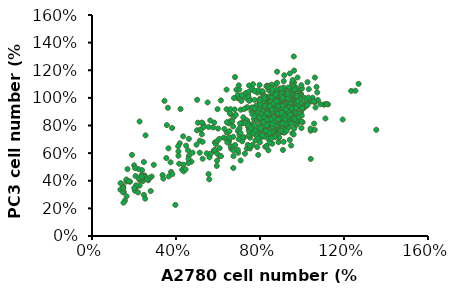
| Category | PC3 |
|---|---|
| 0.9260116677470136 | 0.946 |
| 0.6408000740809334 | 0.918 |
| 0.8423002129826835 | 0.901 |
| 0.8823039170293546 | 0.904 |
| 0.4341142698398 | 0.722 |
| 0.8156310769515696 | 0.885 |
| 0.8897120103713306 | 0.888 |
| 0.9097138623946661 | 0.912 |
| 0.3452171497360867 | 0.978 |
| 0.9200851930734327 | 0.929 |
| 0.9023057690526901 | 0.923 |
| 0.9097138623946661 | 0.904 |
| 0.8778590610241689 | 0.909 |
| 0.8378553569774979 | 0.913 |
| 0.9037873877210852 | 0.896 |
| 0.9630521344568942 | 0.925 |
| 0.7830354662468747 | 0.94 |
| 0.8326696916381147 | 0.975 |
| 0.8904528197055283 | 0.93 |
| 0.9141587183998519 | 0.901 |
| 0.858598018335031 | 0.901 |
| 0.9334197610889897 | 0.891 |
| 0.9111954810630614 | 0.905 |
| 1.1045467172886378 | 0.951 |
| 0.7645152328919345 | 1.059 |
| 0.8911936290397259 | 1.015 |
| 0.8904528197055283 | 0.996 |
| 0.9763867024724512 | 0.992 |
| 0.8534123529956478 | 0.908 |
| 0.8897120103713306 | 0.961 |
| 0.9356421890915826 | 0.933 |
| 1.075655153254931 | 0.985 |
| 0.694879155477359 | 0.997 |
| 0.8230391702935457 | 0.98 |
| 0.8734142050189833 | 0.955 |
| 0.8060005556070007 | 0.964 |
| 0.7363644781924252 | 0.93 |
| 0.9682377997962774 | 0.908 |
| 0.8608204463376239 | 0.904 |
| 1.113436429299009 | 0.956 |
| 0.6874710621353829 | 1.059 |
| 0.7341420501898324 | 1 |
| 0.8111862209463839 | 1.031 |
| 0.3970738031299194 | 0.225 |
| 0.8430410223168812 | 0.974 |
| 0.9734234651356607 | 0.973 |
| 0.862302065006019 | 0.964 |
| 0.9430502824335587 | 0.991 |
| 0.7978516529308269 | 1.094 |
| 0.6763589221224188 | 0.999 |
| 0.7534030928789702 | 0.985 |
| 0.8274840262987314 | 0.94 |
| 0.8208167422909529 | 0.964 |
| 0.7971108435966293 | 0.939 |
| 0.8637836836744143 | 0.956 |
| 1.0504676358922123 | 1.001 |
| 0.6408000740809334 | 1.06 |
| 0.597833132697472 | 0.918 |
| 0.7400685248634132 | 0.932 |
| 0.7430317622002037 | 1.027 |
| 0.8252615982961385 | 0.927 |
| 0.7741457542365033 | 0.986 |
| 0.8363737383091027 | 1.005 |
| 0.925270858412816 | 1.038 |
| 1.0726919159181405 | 1.039 |
| 0.7897027502546532 | 0.929 |
| 0.7593295675525512 | 0.903 |
| 0.8630428743402166 | 0.85 |
| 0.8482266876562645 | 0.888 |
| 0.8882303917029355 | 0.942 |
| 0.9297157144180017 | 0.896 |
| 1.045281970552829 | 0.974 |
| 0.8534123529956478 | 0.996 |
| 0.8022965089360126 | 0.938 |
| 0.5504213353088249 | 0.967 |
| 0.22668765626446893 | 0.829 |
| 0.771182516899713 | 0.846 |
| 0.831928882303917 | 0.877 |
| 0.8022965089360126 | 0.965 |
| 0.965274562459487 | 1.001 |
| 0.8210005706676812 | 0.978 |
| 0.8735019973368842 | 0.944 |
| 0.8818717899942933 | 0.873 |
| 0.9214380825565912 | 0.813 |
| 0.9267643142476698 | 0.804 |
| 1.0112231310633442 | 0.954 |
| 0.9602434848773065 | 0.827 |
| 0.7601293513410691 | 0.929 |
| 0.9686132775347156 | 0.908 |
| 0.7920867414875404 | 0.936 |
| 0.6574091687274111 | 0.831 |
| 0.9298078752140004 | 0.859 |
| 0.9762221799505422 | 0.811 |
| 0.9678523872931329 | 0.859 |
| 0.948069241011984 | 0.898 |
| 0.9396994483545749 | 0.982 |
| 0.9085029484496862 | 0.925 |
| 0.8400228267072475 | 0.904 |
| 0.8156743389766026 | 0.846 |
| 0.7631729123073997 | 0.748 |
| 0.8210005706676812 | 0.776 |
| 0.5820810348107286 | 0.821 |
| 0.8438272779151608 | 0.927 |
| 0.9085029484496862 | 0.982 |
| 0.9336123264219136 | 1.001 |
| 0.8780673387863801 | 0.915 |
| 0.8674148754042229 | 0.892 |
| 0.9054593874833555 | 0.802 |
| 0.983070192124786 | 0.837 |
| 1.0074186798554308 | 0.925 |
| 0.9442647898040708 | 0.93 |
| 1.2341639718470612 | 1.05 |
| 0.8308921438082557 | 1.002 |
| 0.8620886437131444 | 0.932 |
| 0.9686132775347156 | 0.857 |
| 0.8194787901845159 | 0.857 |
| 0.8118698877686894 | 0.946 |
| 0.8286094730835077 | 0.818 |
| 0.8293703633250904 | 0.89 |
| 0.8293703633250904 | 0.86 |
| 0.9107856191744341 | 0.846 |
| 0.9678523872931329 | 0.895 |
| 0.932851436180331 | 0.854 |
| 0.8696975461289709 | 0.769 |
| 0.9267643142476698 | 0.773 |
| 0.8894806924101198 | 0.754 |
| 0.8575233022636485 | 0.813 |
| 0.8818717899942933 | 0.838 |
| 1.0272018261365798 | 0.963 |
| 0.9244816435229218 | 0.867 |
| 0.8483926193646566 | 0.818 |
| 0.2548982309301883 | 0.729 |
| 0.8833935704774586 | 0.877 |
| 0.948069241011984 | 0.873 |
| 0.8856762412022066 | 0.83 |
| 0.9396994483545749 | 0.816 |
| 0.8704584363705535 | 0.937 |
| 0.8103481072855241 | 0.839 |
| 0.9130682898991821 | 0.749 |
| 0.9130682898991821 | 0.796 |
| 0.8628495339547271 | 0.854 |
| 0.9343732166634963 | 0.863 |
| 0.9229598630397565 | 0.842 |
| 0.42153319383678906 | 0.919 |
| 0.5006657789613849 | 0.986 |
| 0.8346965950161689 | 0.836 |
| 0.7951303024538711 | 0.716 |
| 0.8963287045843638 | 0.751 |
| 0.49990488871980215 | 0.765 |
| 0.8696975461289709 | 0.882 |
| 0.9686132775347156 | 0.949 |
| 1.0188320334791707 | 0.94 |
| 0.9107856191744341 | 0.853 |
| 0.9404603385961575 | 0.867 |
| 0.9024158265170249 | 0.784 |
| 0.8902415826517025 | 0.961 |
| 0.9275252044892525 | 1.051 |
| 0.9435038995624881 | 1.064 |
| 0.9602434848773065 | 0.966 |
| 0.8955678143427811 | 1.02 |
| 0.6607535194076003 | 0.822 |
| 0.7994141101798357 | 0.967 |
| 0.8280576124989828 | 0.833 |
| 0.7922532346000488 | 0.855 |
| 0.8632110017088453 | 0.833 |
| 0.8749287981121328 | 0.954 |
| 0.8807876963137765 | 0.978 |
| 0.6939539425502482 | 1.02 |
| 0.8104809178940516 | 0.95 |
| 0.9322158027504273 | 0.942 |
| 0.9315648140613557 | 0.884 |
| 0.9048742778094231 | 0.89 |
| 0.9680201806493612 | 0.964 |
| 0.8156888274066239 | 0.863 |
| 0.8697208885995605 | 0.906 |
| 0.8521441939946294 | 0.922 |
| 0.8254536577426967 | 0.985 |
| 0.38147937179591507 | 0.782 |
| 0.9478395312881439 | 0.95 |
| 0.9165920742127106 | 0.865 |
| 0.8768817641793474 | 0.881 |
| 0.9374237122629995 | 0.978 |
| 0.891203515338921 | 1.002 |
| 0.8892505492717064 | 0.967 |
| 0.8658149564651314 | 1.026 |
| 0.8189437708519814 | 0.972 |
| 0.8664659451542029 | 0.996 |
| 0.8859956058263487 | 0.998 |
| 0.9231019611034258 | 1.023 |
| 0.8977134022296362 | 0.961 |
| 0.8410773862804134 | 1.055 |
| 0.8339165107006266 | 1.089 |
| 0.9439335991537147 | 0.863 |
| 0.7824884042639759 | 0.945 |
| 0.925705915859712 | 0.945 |
| 0.9231019611034258 | 0.948 |
| 0.7069737163316787 | 0.996 |
| 0.9458865652209293 | 0.918 |
| 0.8449833184148425 | 1.01 |
| 0.9120351533892098 | 1.028 |
| 0.8293595898771259 | 0.938 |
| 0.9602083163805029 | 0.999 |
| 0.8202457482301245 | 0.983 |
| 0.9374237122629995 | 0.959 |
| 0.9374237122629995 | 0.932 |
| 0.9615102937586459 | 1.086 |
| 0.9185450402799251 | 0.98 |
| 0.8684189112214176 | 1.038 |
| 0.7831393929530475 | 0.911 |
| 0.9465375539100008 | 0.913 |
| 0.9465375539100008 | 0.94 |
| 0.9204980063471397 | 0.905 |
| 0.9074782325657091 | 0.926 |
| 0.9400276670192855 | 0.908 |
| 0.998616649035723 | 0.951 |
| 0.95044348604443 | 0.871 |
| 0.8007160875579786 | 0.994 |
| 0.8606070469525592 | 1.05 |
| 0.8664659451542029 | 1.044 |
| 0.9491415086662869 | 0.972 |
| 0.9003173569859224 | 1.02 |
| 0.9530474408007161 | 1.086 |
| 0.8957604361624216 | 1.03 |
| 0.9608593050695744 | 1.3 |
| 0.8462852957929856 | 1.087 |
| 0.8514932053055578 | 0.998 |
| 1.0643665066319472 | 0.93 |
| 0.9953617055903654 | 0.898 |
| 0.9940597282122223 | 1.023 |
| 0.9660672145821466 | 1.006 |
| 0.9328667914394987 | 0.983 |
| 0.9328667914394987 | 1.054 |
| 0.9348197575067133 | 1.018 |
| 0.8905525266498494 | 0.975 |
| 0.9725771014728619 | 0.924 |
| 0.9029213117422085 | 0.986 |
| 0.5045162340304338 | 0.82 |
| 0.9296118479941411 | 1.015 |
| 0.9953617055903654 | 1.03 |
| 1.0324680608674424 | 1.063 |
| 0.9274790330537741 | 1.028 |
| 0.9248478868607137 | 0.906 |
| 0.9248478868607137 | 0.943 |
| 0.8097352409143233 | 0.818 |
| 0.8643315244203256 | 0.861 |
| 0.9583950008222332 | 1.014 |
| 0.9248478868607137 | 1.021 |
| 0.9222167406676534 | 0.951 |
| 0.874198322644302 | 1.097 |
| 0.7136984048676205 | 1.019 |
| 0.8663048840651209 | 0.875 |
| 0.8919585594474593 | 0.867 |
| 0.9031409307679658 | 0.935 |
| 0.9537904949843776 | 1.108 |
| 0.9629995066600888 | 1.11 |
| 0.9544482815326426 | 1.11 |
| 0.8123663871073836 | 1.043 |
| 0.7452721591843446 | 1.01 |
| 0.8307844104588061 | 1.084 |
| 0.8695938168064463 | 0.98 |
| 0.9314257523433646 | 0.968 |
| 0.8584114454859398 | 0.977 |
| 0.8649893109685907 | 0.964 |
| 0.8557802992928795 | 1.096 |
| 0.8788028284821575 | 1.018 |
| 0.8663048840651209 | 0.951 |
| 0.9419503371156059 | 1.177 |
| 0.8334155566518665 | 0.929 |
| 0.9524749218878474 | 0.975 |
| 0.8853806939648085 | 1.025 |
| 0.9123499424436771 | 1.075 |
| 0.89722085183358 | 0.926 |
| 0.9044565038644959 | 1.049 |
| 0.9090610097023516 | 1.023 |
| 0.9360302581812202 | 1.076 |
| 0.8018418023351422 | 0.971 |
| 0.8886696267061338 | 1.048 |
| 0.7814504193389246 | 0.915 |
| 0.9189278079263279 | 0.989 |
| 0.9044565038644959 | 0.924 |
| 0.672915638875185 | 0.492 |
| 0.9406347640190759 | 0.93 |
| 0.9156388751850024 | 1.164 |
| 0.732774214767308 | 1.035 |
| 0.8584114454859398 | 0.986 |
| 0.7873704982733103 | 1.038 |
| 0.8814339746752179 | 1.189 |
| 0.9695773721427396 | 0.966 |
| 0.7643479690840322 | 0.929 |
| 0.8965630652853149 | 0.963 |
| 0.9130077289919422 | 1.121 |
| 0.9209011675711232 | 1.023 |
| 0.89722085183358 | 0.944 |
| 0.9814175300115112 | 1.051 |
| 0.9998355533629337 | 1.068 |
| 0.9728663048840651 | 0.959 |
| 0.9097187962506167 | 0.776 |
| 0.8248643315244203 | 0.955 |
| 0.9320835388916296 | 0.993 |
| 0.9182700213780628 | 0.75 |
| 0.7492188784739352 | 0.79 |
| 0.9551060680809077 | 0.986 |
| 0.9820753165597763 | 1.028 |
| 0.6597599079098833 | 0.884 |
| 0.9333991119881598 | 0.934 |
| 0.9399769774708108 | 0.939 |
| 0.9399769774708108 | 1.012 |
| 0.8834073343200132 | 0.936 |
| 0.747903305377405 | 1.09 |
| 0.8807761881269528 | 1.039 |
| 0.9557638546291728 | 1.129 |
| 0.9623417201118237 | 1.197 |
| 0.919585594474593 | 0.835 |
| 0.8952474921887847 | 1.067 |
| 0.9110343693471469 | 0.981 |
| 0.9445814833086663 | 1.003 |
| 0.9248478868607137 | 0.985 |
| 0.9603683604670284 | 1.083 |
| 0.9478704160499918 | 1.008 |
| 0.9893109685906923 | 1.021 |
| 0.954176388240784 | 0.876 |
| 0.9459636024265049 | 0.93 |
| 0.9795613625758283 | 0.945 |
| 0.7600559962669156 | 0.745 |
| 0.7637890807279515 | 0.808 |
| 1.026598226784881 | 0.97 |
| 0.9041530564629024 | 0.939 |
| 0.842183854409706 | 0.867 |
| 0.8511432571161922 | 0.939 |
| 0.8563695753616426 | 1.002 |
| 1.0415305646290247 | 0.762 |
| 1.1117125524965001 | 0.851 |
| 0.8720485300979934 | 0.866 |
| 0.854129724685021 | 0.935 |
| 0.1351376574895007 | 0.336 |
| 0.8832477834811012 | 1.017 |
| 0.9489500699953336 | 0.98 |
| 0.9108726084927672 | 0.964 |
| 0.9250583294447037 | 0.96 |
| 0.8795146990200653 | 0.91 |
| 0.8937004199720019 | 0.917 |
| 0.6592627158189454 | 0.918 |
| 0.8981801213252449 | 0.986 |
| 0.8989267382174522 | 0.995 |
| 1.0691553896406907 | 1.08 |
| 0.19038730751283248 | 0.587 |
| 0.9317778814745684 | 0.967 |
| 0.8929538030797947 | 0.92 |
| 0.9332711152589828 | 1.027 |
| 0.9601493233784414 | 1.04 |
| 0.8623425104993 | 0.891 |
| 0.9168455436304246 | 0.941 |
| 0.7010732617825478 | 1.06 |
| 0.9078861409239384 | 0.928 |
| 0.9571628558096127 | 1.023 |
| 0.8974335044330378 | 0.818 |
| 0.9243117125524964 | 0.853 |
| 0.9116192253849743 | 0.933 |
| 0.9489500699953336 | 0.885 |
| 0.9153523098460102 | 0.899 |
| 0.6809146056929538 | 1.151 |
| 0.8391973868408773 | 1.078 |
| 0.8787680821278582 | 0.901 |
| 0.8160522631824545 | 0.87 |
| 0.9720951936537564 | 1.072 |
| 0.9377508166122258 | 0.788 |
| 0.36136257582827813 | 0.928 |
| 0.9810545963602426 | 0.98 |
| 0.8586094260382641 | 1.06 |
| 0.9041530564629024 | 1.032 |
| 0.9930004666355576 | 0.937 |
| 0.8563695753616426 | 0.815 |
| 1.1236584227718152 | 0.953 |
| 0.9892673821745217 | 0.885 |
| 0.926551563229118 | 0.762 |
| 0.9594027064862343 | 0.823 |
| 0.6988334111059262 | 1.091 |
| 0.745870275314979 | 1.044 |
| 0.7622958469435371 | 1.067 |
| 0.6137190853943071 | 0.982 |
| 0.7988800746616892 | 0.915 |
| 0.8496500233317779 | 0.908 |
| 0.9989734017732151 | 0.873 |
| 0.8130657956136258 | 0.908 |
| 0.8108259449370042 | 1.049 |
| 0.8571161922538497 | 1.039 |
| 0.8772748483434438 | 1.057 |
| 0.8698086794213719 | 0.979 |
| 0.9362575828278115 | 0.963 |
| 0.9982267848810079 | 0.936 |
| 1.0601959869342044 | 0.968 |
| 0.7667755482967802 | 1.099 |
| 0.8406906206252917 | 0.898 |
| 0.8511432571161922 | 0.972 |
| 0.7921605226318246 | 1.056 |
| 0.822025198320112 | 0.943 |
| 0.8526364909006067 | 1.072 |
| 0.9706019598693421 | 1.013 |
| 1.0878208119458703 | 0.954 |
| 0.9788147456836211 | 1.148 |
| 0.3765527950310559 | 0.464 |
| 0.20419254658385094 | 0.328 |
| 0.18090062111801242 | 0.393 |
| 0.8400621118012422 | 0.621 |
| 0.7368012422360248 | 0.632 |
| 0.8586956521739131 | 0.668 |
| 0.7523291925465838 | 0.633 |
| 0.9790372670807453 | 1.007 |
| 0.35403726708074534 | 0.564 |
| 0.2422360248447205 | 0.397 |
| 0.43478260869565216 | 0.516 |
| 0.6071428571428571 | 0.579 |
| 0.8881987577639752 | 0.68 |
| 0.8936335403726708 | 0.757 |
| 0.9914596273291926 | 0.831 |
| 0.7756211180124224 | 0.749 |
| 0.20729813664596272 | 0.434 |
| 0.3641304347826087 | 0.635 |
| 0.6964285714285714 | 0.758 |
| 0.7523291925465838 | 0.712 |
| 0.7888198757763976 | 0.74 |
| 0.781832298136646 | 0.728 |
| 0.7468944099378882 | 0.772 |
| 0.7476708074534162 | 0.73 |
| 0.8222049689440993 | 1.015 |
| 0.7282608695652174 | 0.596 |
| 0.47360248447204967 | 0.538 |
| 0.2267080745341615 | 0.365 |
| 0.6964285714285714 | 0.603 |
| 0.5846273291925466 | 0.677 |
| 0.20729813664596272 | 0.349 |
| 0.6420807453416149 | 0.749 |
| 0.7243788819875776 | 0.714 |
| 0.9736024844720497 | 0.806 |
| 0.2841614906832298 | 0.43 |
| 0.8346273291925466 | 0.727 |
| 0.42934782608695654 | 0.479 |
| 0.84472049689441 | 0.713 |
| 0.5768633540372671 | 0.786 |
| 0.45729813664596275 | 0.621 |
| 0.2942546583850932 | 0.515 |
| 0.7919254658385093 | 0.772 |
| 0.8043478260869565 | 0.931 |
| 0.5551242236024845 | 0.448 |
| 0.922360248447205 | 0.802 |
| 0.7927018633540373 | 0.919 |
| 0.8020186335403726 | 0.768 |
| 0.9456521739130435 | 0.892 |
| 0.562888198757764 | 0.836 |
| 0.8517080745341615 | 0.717 |
| 0.6956521739130435 | 0.764 |
| 0.2468944099378882 | 0.536 |
| 0.53027950310559 | 0.807 |
| 0.7360248447204969 | 0.836 |
| 0.7274844720496895 | 0.836 |
| 0.8711180124223602 | 0.848 |
| 0.8812111801242236 | 1.109 |
| 0.8874223602484472 | 0.848 |
| 0.7600931677018633 | 0.757 |
| 0.8889751552795031 | 0.712 |
| 0.23680124223602483 | 0.443 |
| 0.25077639751552794 | 0.438 |
| 0.23835403726708074 | 0.477 |
| 0.7958074534161491 | 0.798 |
| 0.9425465838509317 | 1.016 |
| 0.8781055900621118 | 0.827 |
| 1.0015527950310559 | 0.924 |
| 0.9021739130434783 | 0.79 |
| 0.7857142857142857 | 0.838 |
| 0.4611801242236025 | 0.579 |
| 0.7383540372670807 | 0.836 |
| 1.0566770186335404 | 0.974 |
| 0.22127329192546583 | 0.484 |
| 0.44798136645962733 | 0.654 |
| 0.702639751552795 | 0.78 |
| 0.7204968944099379 | 0.859 |
| 0.6793478260869565 | 0.916 |
| 0.6545031055900621 | 0.758 |
| 0.717391304347826 | 0.824 |
| 0.9953416149068323 | 0.964 |
| 0.7124448367166814 | 0.696 |
| 0.8444836716681376 | 0.798 |
| 0.8889673433362754 | 0.739 |
| 0.20970873786407768 | 0.367 |
| 1.002647837599294 | 0.823 |
| 0.8691968225948808 | 0.772 |
| 0.8218887908208297 | 0.806 |
| 1.0259488084730803 | 0.947 |
| 0.7915269196822595 | 0.587 |
| 0.43636363636363634 | 0.468 |
| 0.8614298323036187 | 0.846 |
| 1.0407766990291263 | 0.778 |
| 0.7781112091791703 | 0.691 |
| 0.8910856134157105 | 0.714 |
| 0.37422771403353927 | 0.534 |
| 1.0005295675198589 | 0.926 |
| 0.8190644307149162 | 0.72 |
| 0.5959399823477494 | 0.598 |
| 0.8903795233892321 | 0.88 |
| 0.8903795233892321 | 0.767 |
| 0.5825242718446602 | 0.62 |
| 0.2796116504854369 | 0.325 |
| 0.9807590467784643 | 0.942 |
| 1.1170344218887909 | 0.955 |
| 0.7025595763459841 | 0.734 |
| 0.8854368932038835 | 0.822 |
| 0.8522506619593998 | 0.91 |
| 0.7985878199470432 | 0.703 |
| 0.953927625772286 | 0.743 |
| 0.9659311562224183 | 0.819 |
| 0.8776699029126214 | 0.952 |
| 0.35657546337157986 | 0.803 |
| 0.7555163283318623 | 0.767 |
| 0.8473080317740512 | 0.858 |
| 0.9433362753751103 | 0.855 |
| 0.8289496910856134 | 0.768 |
| 0.9977052074139453 | 0.83 |
| 0.9299205648720212 | 0.823 |
| 0.9221535745807591 | 0.911 |
| 0.9285083848190644 | 1.037 |
| 0.7180935569285084 | 0.815 |
| 0.8042365401588703 | 0.886 |
| 0.7865842894969108 | 0.866 |
| 0.8529567519858782 | 0.752 |
| 0.9355692850838482 | 0.94 |
| 0.9920564872021183 | 0.991 |
| 1.0132391879964695 | 0.999 |
| 0.9659311562224183 | 1.062 |
| 0.5902912621359223 | 0.666 |
| 0.2266548984995587 | 0.411 |
| 0.8473080317740512 | 0.93 |
| 0.25136804942630186 | 0.428 |
| 0.7449249779346867 | 0.816 |
| 1.0217122683142101 | 0.987 |
| 0.9786407766990292 | 1.033 |
| 1.26954986760812 | 1.102 |
| 0.860017652250662 | 0.75 |
| 0.6524271844660194 | 0.684 |
| 0.7442188879082083 | 0.79 |
| 0.5959399823477494 | 0.687 |
| 0.9094439541041482 | 0.623 |
| 0.6058252427184466 | 0.703 |
| 0.8875551632833186 | 0.92 |
| 1.0612533097969992 | 1.147 |
| 0.7300970873786408 | 0.818 |
| 0.5133274492497794 | 0.69 |
| 0.2266548984995587 | 0.406 |
| 0.9045013239187997 | 0.906 |
| 0.336098852603707 | 0.442 |
| 0.23654015887025595 | 0.412 |
| 0.41800529567519856 | 0.671 |
| 0.8812003530450132 | 1.031 |
| 0.7639894086496029 | 0.882 |
| 0.942630185348632 | 0.843 |
| 0.8007060900264784 | 0.944 |
| 0.893909973521624 | 0.768 |
| 0.8621359223300971 | 0.836 |
| 0.8409532215357458 | 0.807 |
| 0.7894086496028243 | 0.856 |
| 0.7738746690203001 | 1.05 |
| 0.6080741742321808 | 0.636 |
| 0.9627197218466294 | 0.777 |
| 0.7417423218079969 | 0.659 |
| 0.79119180992853 | 0.707 |
| 0.6629322001158973 | 0.632 |
| 0.7865559204172301 | 0.644 |
| 0.873092524628163 | 0.81 |
| 0.8978172686884296 | 0.835 |
| 0.559397334363531 | 0.569 |
| 0.22406799304616573 | 0.418 |
| 0.7077457987251304 | 0.547 |
| 0.9604017770909793 | 0.735 |
| 0.16457407765114931 | 0.287 |
| 0.21943210353486575 | 0.316 |
| 0.238748309831949 | 0.422 |
| 0.2742901294185822 | 0.42 |
| 0.41182151825381497 | 0.612 |
| 0.6722039791384972 | 0.794 |
| 0.7154722812439637 | 0.685 |
| 0.8128259609812633 | 0.735 |
| 0.9124975854742129 | 0.682 |
| 1.041529843538729 | 0.558 |
| 0.26810894340351554 | 0.404 |
| 1.193741549159745 | 0.843 |
| 0.16380142939926598 | 0.395 |
| 0.8251883330113966 | 0.646 |
| 0.24724744060266562 | 0.298 |
| 0.5269461077844312 | 0.559 |
| 0.8738651728800464 | 0.725 |
| 0.15684759513231603 | 0.256 |
| 0.6737492756422638 | 0.578 |
| 1.0608460498358123 | 0.769 |
| 0.6946107784431138 | 0.623 |
| 0.8043268302105466 | 0.765 |
| 0.6606142553602472 | 0.649 |
| 0.8298242225226965 | 0.65 |
| 0.14989376086536604 | 0.241 |
| 0.6273903805292641 | 0.712 |
| 0.7641491211126135 | 0.659 |
| 1.3536797372995943 | 0.769 |
| 0.5153563840061812 | 0.77 |
| 0.5462623140815144 | 0.599 |
| 0.6142553602472475 | 0.578 |
| 0.14834846436159937 | 0.361 |
| 0.3654626231408151 | 0.432 |
| 0.6397527525593973 | 0.703 |
| 0.8390960015452965 | 0.839 |
| 0.8414139463009465 | 0.734 |
| 0.20088854548966584 | 0.512 |
| 0.2534286266177323 | 0.271 |
| 0.5941665056982809 | 0.507 |
| 0.7525593973343635 | 0.653 |
| 0.8390960015452965 | 0.705 |
| 0.8460498358122465 | 0.677 |
| 0.948039405060846 | 0.655 |
| 0.8035541819586633 | 0.849 |
| 0.4102762217500483 | 0.65 |
| 0.8313695190264632 | 0.65 |
| 0.9418582190457794 | 0.696 |
| 0.5957118022020476 | 0.544 |
| 1.057755456828279 | 0.814 |
| 0.971218852617346 | 0.836 |
| 0.9488120533127293 | 0.814 |
| 0.6304809735367973 | 0.776 |
| 0.7873285686691134 | 0.889 |
| 0.8197797952482132 | 0.72 |
| 0.718562874251497 | 0.715 |
| 0.8700019316206297 | 0.715 |
| 0.5130384392505312 | 0.603 |
| 0.5655785203785977 | 0.596 |
| 0.5269461077844312 | 0.682 |
| 0.6722039791384972 | 0.718 |
| 0.8584122078423797 | 0.931 |
| 0.9209967162449295 | 0.834 |
| 0.16380142939926598 | 0.409 |
| 0.9974888931813792 | 0.781 |
| 0.8545489665829631 | 0.707 |
| 0.44581804133668146 | 0.482 |
| 0.1514390573691327 | 0.319 |
| 0.7996909406992466 | 0.679 |
| 0.8152694862524174 | 0.975 |
| 0.8011435298074497 | 0.958 |
| 0.708315816026234 | 0.914 |
| 0.8650466661061128 | 0.961 |
| 0.6740099218027411 | 0.859 |
| 0.5556209535020601 | 0.789 |
| 0.8583200201799378 | 0.892 |
| 0.8152694862524174 | 0.844 |
| 0.41167073068191373 | 0.581 |
| 0.6524846548389809 | 0.699 |
| 0.7823089212141596 | 0.871 |
| 0.9161691751450433 | 0.953 |
| 0.7453123686201968 | 0.793 |
| 0.9504750693685361 | 0.965 |
| 0.9350037837383335 | 1.017 |
| 0.7480030269906668 | 0.979 |
| 0.8206508029933575 | 0.998 |
| 0.8993525603296056 | 0.932 |
| 0.14798621037585133 | 0.317 |
| 0.8704279828470529 | 0.804 |
| 0.2011267131926343 | 0.347 |
| 0.9477844109980661 | 0.966 |
| 0.9444210880349786 | 0.933 |
| 1.254519465231649 | 1.052 |
| 0.7251324308416716 | 0.92 |
| 0.711006474396704 | 0.977 |
| 0.667283275876566 | 0.83 |
| 0.7991255360295972 | 0.984 |
| 0.887917262255108 | 0.973 |
| 0.886571933069873 | 0.939 |
| 0.14865887496846886 | 0.348 |
| 0.17623812326578658 | 0.396 |
| 0.4614479105356092 | 0.703 |
| 0.6847725552846212 | 0.877 |
| 0.774909610695367 | 0.924 |
| 0.656520642394686 | 0.889 |
| 0.8596653493651728 | 1.06 |
| 0.8993525603296056 | 1.067 |
| 0.8522660388463802 | 0.914 |
| 0.996888926259144 | 1.092 |
| 0.5583116118725301 | 0.41 |
| 0.23677793660136215 | 0.43 |
| 0.82266879677121 | 0.837 |
| 0.8374674178087951 | 0.836 |
| 0.7594383250651644 | 0.754 |
| 0.9323131253678635 | 0.841 |
| 0.8939712435886656 | 0.848 |
| 1.0264861683343143 | 1.114 |
| 0.9087698646262508 | 0.943 |
| 0.8287227781047675 | 0.761 |
| 0.9827629698141764 | 0.859 |
| 0.9646010258135037 | 0.847 |
| 0.6006894812074329 | 0.778 |
| 0.8711006474396704 | 0.851 |
| 0.9450937526275961 | 0.954 |
| 0.9793996468510888 | 0.975 |
| 0.8805179517363155 | 0.914 |
| 0.9403851004792735 | 0.991 |
| 0.6504666610611284 | 0.815 |
| 0.9255864794416884 | 0.909 |
| 0.8791726225510804 | 0.975 |
| 0.935676448330951 | 0.918 |
| 0.9457664172202136 | 0.904 |
| 0.9538383923316236 | 0.935 |
| 0.773564281510132 | 0.867 |
| 0.8462120575128227 | 0.94 |
| 0.8939712435886656 | 0.882 |
| 0.9074245354410158 | 0.896 |
| 0.9006978895148406 | 0.867 |
| 0.8778272933658454 | 0.803 |
| 0.9417304296645085 | 0.904 |
| 1.0305221558900193 | 1.002 |
| 0.8193054738081225 | 0.86 |
| 0.7984528714369797 | 0.856 |
| 0.6982258471369713 | 0.701 |
| 0.8926259144034306 | 0.815 |
| 0.932985789960481 | 1.001 |
| 0.8650466661061128 | 0.76 |
| 0.9336584545530985 | 0.859 |
| 0.939712435886656 | 0.932 |
| 0.16898345888017396 | 0.484 |
| 0.951774481633921 | 0.923 |
| 0.921953871243302 | 0.812 |
| 0.8554787605808807 | 0.777 |
| 0.8585850741632368 | 0.752 |
| 0.7672594548419663 | 0.743 |
| 0.8598275995961793 | 0.793 |
| 0.7436514716160596 | 0.802 |
| 0.5231032072687738 | 0.736 |
| 0.26279412906732935 | 0.412 |
| 0.9033159897491652 | 0.812 |
| 0.45973441018870853 | 0.558 |
| 0.8995884134503378 | 0.763 |
| 0.9008309388832803 | 0.854 |
| 0.14848178923662345 | 0.349 |
| 0.13605653490719888 | 0.382 |
| 0.6535683777277316 | 0.714 |
| 0.673448784654811 | 0.619 |
| 0.7480003106313582 | 0.758 |
| 0.6728275219383397 | 0.648 |
| 0.7641531412596102 | 0.789 |
| 0.8095053195620098 | 0.73 |
| 0.9089073541974062 | 0.873 |
| 0.9331366001397841 | 0.901 |
| 0.8741166420750175 | 1.023 |
| 0.580880639900598 | 0.62 |
| 0.7765783955890347 | 0.763 |
| 0.8424322435349848 | 0.811 |
| 0.8014289042478838 | 0.777 |
| 0.523724469985245 | 0.821 |
| 0.6423856488312495 | 0.824 |
| 0.9058010406150501 | 0.99 |
| 0.6815251999689369 | 0.659 |
| 0.6442494369806632 | 0.678 |
| 0.5846082161994254 | 0.624 |
| 0.4789935543993166 | 0.603 |
| 0.7554554632290129 | 0.78 |
| 0.9151199813621185 | 0.874 |
| 0.8908907354197406 | 0.901 |
| 0.9797313038751262 | 1.015 |
| 0.41500349460278013 | 0.523 |
| 0.49763143589345343 | 0.661 |
| 0.8312495146385027 | 0.799 |
| 0.9070435660479925 | 0.814 |
| 0.8585850741632368 | 0.812 |
| 0.8877844218373845 | 0.886 |
| 0.8691465403432477 | 0.836 |
| 0.8859206336879708 | 0.888 |
| 0.5206181564028889 | 0.772 |
| 0.9026947270326939 | 1.011 |
| 0.9207113458103595 | 0.846 |
| 0.8418109808185136 | 0.89 |
| 0.8548574978644095 | 0.848 |
| 0.9157412440785897 | 0.917 |
| 0.4591131474722373 | 0.528 |
| 0.9026947270326939 | 0.892 |
| 0.8573425487302944 | 0.895 |
| 0.5324221480158422 | 0.789 |
| 0.8859206336879708 | 0.843 |
| 0.8567212860138231 | 0.914 |
| 0.8436747689679273 | 0.885 |
| 0.8337345655043876 | 0.888 |
| 0.7051331831948435 | 0.815 |
| 0.9318940747068416 | 1.046 |
| 0.8654189640444203 | 0.859 |
| 0.9238176593927157 | 0.916 |
| 0.9076648287644637 | 1.001 |
| 0.8517511842820533 | 0.845 |
| 0.7069969713442572 | 0.748 |
| 0.845538557117341 | 0.748 |
| 0.8337345655043876 | 0.842 |
| 0.20501669643550516 | 0.492 |
| 0.9312728119903704 | 1.028 |
| 0.7747146074396211 | 0.802 |
| 0.8163392094431933 | 0.823 |
| 0.38269783334627633 | 0.448 |
| 0.9443193290362663 | 0.878 |
| 0.971033625844529 | 0.927 |
| 0.3398307059097616 | 0.416 |
| 0.9760037275762988 | 1.012 |